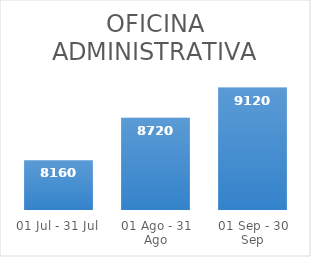
| Category | Series 0 |
|---|---|
| 01 Jul - 31 Jul | 8160 |
| 01 Ago - 31 Ago | 8720 |
| 01 Sep - 30 Sep | 9120 |